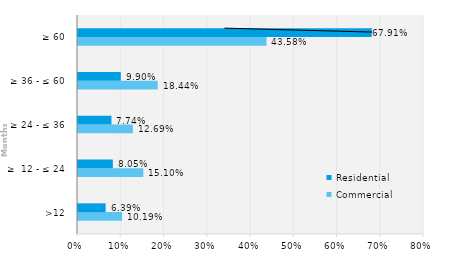
| Category | Commercial | Residential |
|---|---|---|
| >12 | 0.102 | 0.064 |
| ≥  12 - ≤ 24 | 0.151 | 0.081 |
| ≥ 24 - ≤ 36 | 0.127 | 0.077 |
| ≥ 36 - ≤ 60 | 0.184 | 0.099 |
| ≥ 60 | 0.436 | 0.679 |